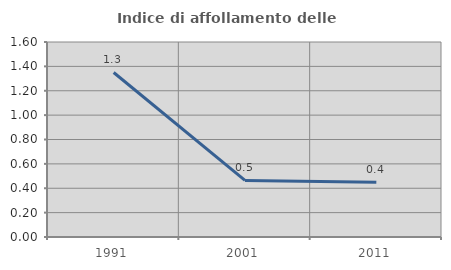
| Category | Indice di affollamento delle abitazioni  |
|---|---|
| 1991.0 | 1.35 |
| 2001.0 | 0.464 |
| 2011.0 | 0.449 |